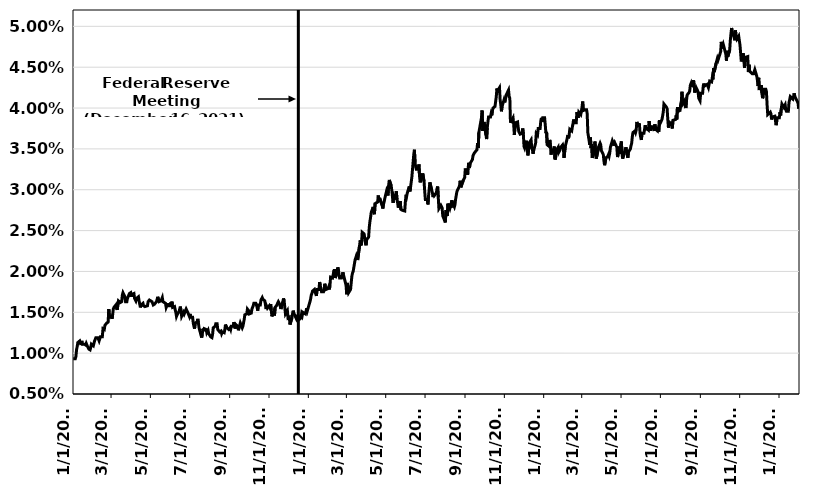
| Category | Series 0 |
|---|---|
| 1/1/21 | 0.009 |
| 1/4/21 | 0.009 |
| 1/5/21 | 0.01 |
| 1/6/21 | 0.01 |
| 1/7/21 | 0.011 |
| 1/8/21 | 0.011 |
| 1/11/21 | 0.012 |
| 1/12/21 | 0.012 |
| 1/13/21 | 0.011 |
| 1/14/21 | 0.012 |
| 1/15/21 | 0.011 |
| 1/18/21 | 0.011 |
| 1/19/21 | 0.011 |
| 1/20/21 | 0.011 |
| 1/21/21 | 0.011 |
| 1/22/21 | 0.011 |
| 1/25/21 | 0.01 |
| 1/26/21 | 0.01 |
| 1/27/21 | 0.01 |
| 1/28/21 | 0.011 |
| 1/29/21 | 0.011 |
| 2/1/21 | 0.011 |
| 2/2/21 | 0.011 |
| 2/3/21 | 0.012 |
| 2/4/21 | 0.012 |
| 2/5/21 | 0.012 |
| 2/8/21 | 0.012 |
| 2/9/21 | 0.012 |
| 2/10/21 | 0.012 |
| 2/11/21 | 0.012 |
| 2/12/21 | 0.012 |
| 2/15/21 | 0.012 |
| 2/16/21 | 0.013 |
| 2/17/21 | 0.013 |
| 2/18/21 | 0.013 |
| 2/19/21 | 0.013 |
| 2/22/21 | 0.014 |
| 2/23/21 | 0.014 |
| 2/24/21 | 0.014 |
| 2/25/21 | 0.015 |
| 2/26/21 | 0.014 |
| 3/1/21 | 0.014 |
| 3/2/21 | 0.014 |
| 3/3/21 | 0.015 |
| 3/4/21 | 0.015 |
| 3/5/21 | 0.016 |
| 3/8/21 | 0.016 |
| 3/9/21 | 0.016 |
| 3/10/21 | 0.015 |
| 3/11/21 | 0.015 |
| 3/12/21 | 0.016 |
| 3/15/21 | 0.016 |
| 3/16/21 | 0.016 |
| 3/17/21 | 0.016 |
| 3/18/21 | 0.017 |
| 3/19/21 | 0.017 |
| 3/22/21 | 0.017 |
| 3/23/21 | 0.016 |
| 3/24/21 | 0.016 |
| 3/25/21 | 0.016 |
| 3/26/21 | 0.017 |
| 3/29/21 | 0.017 |
| 3/30/21 | 0.017 |
| 3/31/21 | 0.017 |
| 4/1/21 | 0.017 |
| 4/2/21 | 0.017 |
| 4/5/21 | 0.017 |
| 4/6/21 | 0.017 |
| 4/7/21 | 0.017 |
| 4/8/21 | 0.016 |
| 4/9/21 | 0.017 |
| 4/12/21 | 0.017 |
| 4/13/21 | 0.016 |
| 4/14/21 | 0.016 |
| 4/15/21 | 0.016 |
| 4/16/21 | 0.016 |
| 4/19/21 | 0.016 |
| 4/20/21 | 0.016 |
| 4/21/21 | 0.016 |
| 4/22/21 | 0.016 |
| 4/23/21 | 0.016 |
| 4/26/21 | 0.016 |
| 4/27/21 | 0.016 |
| 4/28/21 | 0.016 |
| 4/29/21 | 0.016 |
| 4/30/21 | 0.016 |
| 5/3/21 | 0.016 |
| 5/4/21 | 0.016 |
| 5/5/21 | 0.016 |
| 5/6/21 | 0.016 |
| 5/7/21 | 0.016 |
| 5/10/21 | 0.016 |
| 5/11/21 | 0.016 |
| 5/12/21 | 0.017 |
| 5/13/21 | 0.017 |
| 5/14/21 | 0.016 |
| 5/17/21 | 0.016 |
| 5/18/21 | 0.016 |
| 5/19/21 | 0.017 |
| 5/20/21 | 0.016 |
| 5/21/21 | 0.016 |
| 5/24/21 | 0.016 |
| 5/25/21 | 0.016 |
| 5/26/21 | 0.016 |
| 5/27/21 | 0.016 |
| 5/28/21 | 0.016 |
| 5/31/21 | 0.016 |
| 6/1/21 | 0.016 |
| 6/2/21 | 0.016 |
| 6/3/21 | 0.016 |
| 6/4/21 | 0.016 |
| 6/7/21 | 0.016 |
| 6/8/21 | 0.015 |
| 6/9/21 | 0.015 |
| 6/10/21 | 0.014 |
| 6/11/21 | 0.015 |
| 6/14/21 | 0.015 |
| 6/15/21 | 0.015 |
| 6/16/21 | 0.016 |
| 6/17/21 | 0.015 |
| 6/18/21 | 0.014 |
| 6/21/21 | 0.015 |
| 6/22/21 | 0.015 |
| 6/23/21 | 0.015 |
| 6/24/21 | 0.015 |
| 6/25/21 | 0.015 |
| 6/28/21 | 0.015 |
| 6/29/21 | 0.015 |
| 6/30/21 | 0.014 |
| 7/1/21 | 0.015 |
| 7/2/21 | 0.014 |
| 7/5/21 | 0.014 |
| 7/6/21 | 0.014 |
| 7/7/21 | 0.013 |
| 7/8/21 | 0.013 |
| 7/9/21 | 0.014 |
| 7/12/21 | 0.014 |
| 7/13/21 | 0.014 |
| 7/14/21 | 0.014 |
| 7/15/21 | 0.013 |
| 7/16/21 | 0.013 |
| 7/19/21 | 0.012 |
| 7/20/21 | 0.012 |
| 7/21/21 | 0.013 |
| 7/22/21 | 0.013 |
| 7/23/21 | 0.013 |
| 7/26/21 | 0.013 |
| 7/27/21 | 0.012 |
| 7/28/21 | 0.013 |
| 7/29/21 | 0.013 |
| 7/30/21 | 0.012 |
| 8/2/21 | 0.012 |
| 8/3/21 | 0.012 |
| 8/4/21 | 0.012 |
| 8/5/21 | 0.012 |
| 8/6/21 | 0.013 |
| 8/9/21 | 0.013 |
| 8/10/21 | 0.014 |
| 8/11/21 | 0.014 |
| 8/12/21 | 0.014 |
| 8/13/21 | 0.013 |
| 8/16/21 | 0.013 |
| 8/17/21 | 0.013 |
| 8/18/21 | 0.013 |
| 8/19/21 | 0.012 |
| 8/20/21 | 0.013 |
| 8/23/21 | 0.012 |
| 8/24/21 | 0.013 |
| 8/25/21 | 0.014 |
| 8/26/21 | 0.013 |
| 8/27/21 | 0.013 |
| 8/30/21 | 0.013 |
| 8/31/21 | 0.013 |
| 9/1/21 | 0.013 |
| 9/2/21 | 0.013 |
| 9/3/21 | 0.013 |
| 9/6/21 | 0.013 |
| 9/7/21 | 0.014 |
| 9/8/21 | 0.014 |
| 9/9/21 | 0.013 |
| 9/10/21 | 0.014 |
| 9/13/21 | 0.013 |
| 9/14/21 | 0.013 |
| 9/15/21 | 0.013 |
| 9/16/21 | 0.013 |
| 9/17/21 | 0.014 |
| 9/20/21 | 0.013 |
| 9/21/21 | 0.013 |
| 9/22/21 | 0.013 |
| 9/23/21 | 0.014 |
| 9/24/21 | 0.015 |
| 9/27/21 | 0.015 |
| 9/28/21 | 0.015 |
| 9/29/21 | 0.016 |
| 9/30/21 | 0.015 |
| 10/1/21 | 0.015 |
| 10/4/21 | 0.015 |
| 10/5/21 | 0.015 |
| 10/6/21 | 0.015 |
| 10/7/21 | 0.016 |
| 10/8/21 | 0.016 |
| 10/11/21 | 0.016 |
| 10/12/21 | 0.016 |
| 10/13/21 | 0.016 |
| 10/14/21 | 0.015 |
| 10/15/21 | 0.016 |
| 10/18/21 | 0.016 |
| 10/19/21 | 0.016 |
| 10/20/21 | 0.016 |
| 10/21/21 | 0.017 |
| 10/22/21 | 0.017 |
| 10/25/21 | 0.016 |
| 10/26/21 | 0.016 |
| 10/27/21 | 0.015 |
| 10/28/21 | 0.016 |
| 10/29/21 | 0.016 |
| 11/1/21 | 0.016 |
| 11/2/21 | 0.016 |
| 11/3/21 | 0.016 |
| 11/4/21 | 0.015 |
| 11/5/21 | 0.014 |
| 11/8/21 | 0.015 |
| 11/9/21 | 0.015 |
| 11/10/21 | 0.016 |
| 11/12/21 | 0.016 |
| 11/15/21 | 0.016 |
| 11/16/21 | 0.016 |
| 11/17/21 | 0.016 |
| 11/18/21 | 0.016 |
| 11/19/21 | 0.015 |
| 11/22/21 | 0.016 |
| 11/23/21 | 0.017 |
| 11/24/21 | 0.016 |
| 11/25/21 | 0.016 |
| 11/26/21 | 0.015 |
| 11/29/21 | 0.015 |
| 11/30/21 | 0.014 |
| 12/1/21 | 0.014 |
| 12/2/21 | 0.014 |
| 12/3/21 | 0.014 |
| 12/6/21 | 0.014 |
| 12/7/21 | 0.015 |
| 12/8/21 | 0.015 |
| 12/9/21 | 0.015 |
| 12/10/21 | 0.015 |
| 12/13/21 | 0.014 |
| 12/14/21 | 0.014 |
| 12/15/21 | 0.015 |
| 12/16/21 | 0.014 |
| 12/17/21 | 0.014 |
| 12/20/21 | 0.014 |
| 12/21/21 | 0.015 |
| 12/22/21 | 0.015 |
| 12/23/21 | 0.015 |
| 12/27/21 | 0.015 |
| 12/28/21 | 0.015 |
| 12/29/21 | 0.016 |
| 12/30/21 | 0.015 |
| 12/31/21 | 0.015 |
| 1/3/22 | 0.016 |
| 1/4/22 | 0.017 |
| 1/5/22 | 0.017 |
| 1/6/22 | 0.017 |
| 1/7/22 | 0.018 |
| 1/10/22 | 0.018 |
| 1/11/22 | 0.018 |
| 1/12/22 | 0.017 |
| 1/13/22 | 0.017 |
| 1/14/22 | 0.018 |
| 1/17/22 | 0.018 |
| 1/18/22 | 0.019 |
| 1/19/22 | 0.018 |
| 1/20/22 | 0.018 |
| 1/21/22 | 0.018 |
| 1/24/22 | 0.018 |
| 1/25/22 | 0.018 |
| 1/26/22 | 0.019 |
| 1/27/22 | 0.018 |
| 1/28/22 | 0.018 |
| 1/31/22 | 0.018 |
| 2/1/22 | 0.018 |
| 2/2/22 | 0.018 |
| 2/3/22 | 0.018 |
| 2/4/22 | 0.019 |
| 2/7/22 | 0.019 |
| 2/8/22 | 0.02 |
| 2/9/22 | 0.019 |
| 2/10/22 | 0.02 |
| 2/11/22 | 0.019 |
| 2/14/22 | 0.02 |
| 2/15/22 | 0.02 |
| 2/16/22 | 0.02 |
| 2/17/22 | 0.02 |
| 2/18/22 | 0.019 |
| 2/21/22 | 0.019 |
| 2/22/22 | 0.019 |
| 2/23/22 | 0.02 |
| 2/24/22 | 0.02 |
| 2/25/22 | 0.02 |
| 2/28/22 | 0.018 |
| 3/1/22 | 0.017 |
| 3/2/22 | 0.019 |
| 3/3/22 | 0.019 |
| 3/4/22 | 0.017 |
| 3/7/22 | 0.018 |
| 3/8/22 | 0.019 |
| 3/9/22 | 0.019 |
| 3/10/22 | 0.02 |
| 3/11/22 | 0.02 |
| 3/14/22 | 0.021 |
| 3/15/22 | 0.022 |
| 3/16/22 | 0.022 |
| 3/17/22 | 0.022 |
| 3/18/22 | 0.021 |
| 3/21/22 | 0.023 |
| 3/22/22 | 0.024 |
| 3/23/22 | 0.023 |
| 3/24/22 | 0.023 |
| 3/25/22 | 0.025 |
| 3/28/22 | 0.025 |
| 3/29/22 | 0.024 |
| 3/30/22 | 0.024 |
| 3/31/22 | 0.023 |
| 4/1/22 | 0.024 |
| 4/4/22 | 0.024 |
| 4/5/22 | 0.025 |
| 4/6/22 | 0.026 |
| 4/7/22 | 0.027 |
| 4/8/22 | 0.027 |
| 4/11/22 | 0.028 |
| 4/12/22 | 0.027 |
| 4/13/22 | 0.027 |
| 4/14/22 | 0.028 |
| 4/15/22 | 0.028 |
| 4/18/22 | 0.028 |
| 4/19/22 | 0.029 |
| 4/20/22 | 0.028 |
| 4/21/22 | 0.029 |
| 4/22/22 | 0.029 |
| 4/25/22 | 0.028 |
| 4/26/22 | 0.028 |
| 4/27/22 | 0.028 |
| 4/28/22 | 0.028 |
| 4/29/22 | 0.029 |
| 5/2/22 | 0.03 |
| 5/3/22 | 0.03 |
| 5/4/22 | 0.029 |
| 5/5/22 | 0.03 |
| 5/6/22 | 0.031 |
| 5/9/22 | 0.03 |
| 5/10/22 | 0.03 |
| 5/11/22 | 0.029 |
| 5/12/22 | 0.028 |
| 5/13/22 | 0.029 |
| 5/16/22 | 0.029 |
| 5/17/22 | 0.03 |
| 5/18/22 | 0.029 |
| 5/19/22 | 0.028 |
| 5/20/22 | 0.028 |
| 5/23/22 | 0.029 |
| 5/24/22 | 0.028 |
| 5/25/22 | 0.028 |
| 5/26/22 | 0.028 |
| 5/27/22 | 0.027 |
| 5/30/22 | 0.027 |
| 5/31/22 | 0.028 |
| 6/1/22 | 0.029 |
| 6/2/22 | 0.029 |
| 6/3/22 | 0.03 |
| 6/6/22 | 0.03 |
| 6/7/22 | 0.03 |
| 6/8/22 | 0.03 |
| 6/9/22 | 0.03 |
| 6/10/22 | 0.032 |
| 6/13/22 | 0.034 |
| 6/14/22 | 0.035 |
| 6/15/22 | 0.033 |
| 6/16/22 | 0.033 |
| 6/17/22 | 0.032 |
| 6/20/22 | 0.032 |
| 6/21/22 | 0.033 |
| 6/22/22 | 0.032 |
| 6/23/22 | 0.031 |
| 6/24/22 | 0.031 |
| 6/27/22 | 0.032 |
| 6/28/22 | 0.032 |
| 6/29/22 | 0.031 |
| 6/30/22 | 0.03 |
| 7/1/22 | 0.029 |
| 7/4/22 | 0.029 |
| 7/5/22 | 0.028 |
| 7/6/22 | 0.029 |
| 7/7/22 | 0.03 |
| 7/8/22 | 0.031 |
| 7/11/22 | 0.03 |
| 7/12/22 | 0.03 |
| 7/13/22 | 0.029 |
| 7/14/22 | 0.03 |
| 7/15/22 | 0.029 |
| 7/18/22 | 0.03 |
| 7/19/22 | 0.03 |
| 7/20/22 | 0.03 |
| 7/21/22 | 0.029 |
| 7/22/22 | 0.028 |
| 7/25/22 | 0.028 |
| 7/26/22 | 0.028 |
| 7/27/22 | 0.028 |
| 7/28/22 | 0.027 |
| 7/29/22 | 0.027 |
| 8/1/22 | 0.026 |
| 8/2/22 | 0.028 |
| 8/3/22 | 0.027 |
| 8/4/22 | 0.027 |
| 8/5/22 | 0.028 |
| 8/8/22 | 0.028 |
| 8/9/22 | 0.028 |
| 8/10/22 | 0.028 |
| 8/11/22 | 0.029 |
| 8/12/22 | 0.028 |
| 8/15/22 | 0.028 |
| 8/16/22 | 0.028 |
| 8/17/22 | 0.029 |
| 8/18/22 | 0.029 |
| 8/19/22 | 0.03 |
| 8/22/22 | 0.03 |
| 8/23/22 | 0.03 |
| 8/24/22 | 0.031 |
| 8/25/22 | 0.03 |
| 8/26/22 | 0.03 |
| 8/29/22 | 0.031 |
| 8/30/22 | 0.031 |
| 8/31/22 | 0.032 |
| 9/1/22 | 0.033 |
| 9/2/22 | 0.032 |
| 9/5/22 | 0.032 |
| 9/6/22 | 0.033 |
| 9/7/22 | 0.033 |
| 9/8/22 | 0.033 |
| 9/9/22 | 0.033 |
| 9/12/22 | 0.034 |
| 9/13/22 | 0.034 |
| 9/14/22 | 0.034 |
| 9/15/22 | 0.034 |
| 9/16/22 | 0.034 |
| 9/19/22 | 0.035 |
| 9/20/22 | 0.036 |
| 9/21/22 | 0.035 |
| 9/22/22 | 0.037 |
| 9/23/22 | 0.037 |
| 9/26/22 | 0.039 |
| 9/27/22 | 0.04 |
| 9/28/22 | 0.037 |
| 9/29/22 | 0.038 |
| 9/30/22 | 0.038 |
| 10/3/22 | 0.037 |
| 10/4/22 | 0.036 |
| 10/5/22 | 0.038 |
| 10/6/22 | 0.038 |
| 10/7/22 | 0.039 |
| 10/10/22 | 0.039 |
| 10/11/22 | 0.039 |
| 10/12/22 | 0.039 |
| 10/13/22 | 0.04 |
| 10/14/22 | 0.04 |
| 10/17/22 | 0.04 |
| 10/18/22 | 0.04 |
| 10/19/22 | 0.041 |
| 10/20/22 | 0.042 |
| 10/21/22 | 0.042 |
| 10/24/22 | 0.042 |
| 10/25/22 | 0.041 |
| 10/26/22 | 0.04 |
| 10/27/22 | 0.04 |
| 10/28/22 | 0.04 |
| 10/31/22 | 0.041 |
| 11/1/22 | 0.041 |
| 11/2/22 | 0.041 |
| 11/3/22 | 0.041 |
| 11/4/22 | 0.042 |
| 11/7/22 | 0.042 |
| 11/8/22 | 0.041 |
| 11/9/22 | 0.041 |
| 11/10/22 | 0.038 |
| 11/14/22 | 0.039 |
| 11/15/22 | 0.038 |
| 11/16/22 | 0.037 |
| 11/17/22 | 0.038 |
| 11/18/22 | 0.038 |
| 11/21/22 | 0.038 |
| 11/22/22 | 0.038 |
| 11/23/22 | 0.037 |
| 11/24/22 | 0.037 |
| 11/25/22 | 0.037 |
| 11/28/22 | 0.037 |
| 11/29/22 | 0.038 |
| 11/30/22 | 0.037 |
| 12/1/22 | 0.035 |
| 12/2/22 | 0.035 |
| 12/5/22 | 0.036 |
| 12/6/22 | 0.035 |
| 12/7/22 | 0.034 |
| 12/8/22 | 0.035 |
| 12/9/22 | 0.036 |
| 12/12/22 | 0.036 |
| 12/13/22 | 0.035 |
| 12/14/22 | 0.035 |
| 12/15/22 | 0.034 |
| 12/16/22 | 0.035 |
| 12/19/22 | 0.036 |
| 12/20/22 | 0.037 |
| 12/21/22 | 0.037 |
| 12/22/22 | 0.037 |
| 12/23/22 | 0.038 |
| 12/26/22 | 0.038 |
| 12/27/22 | 0.038 |
| 12/28/22 | 0.039 |
| 12/29/22 | 0.038 |
| 12/30/22 | 0.039 |
| 1/2/23 | 0.039 |
| 1/3/23 | 0.038 |
| 1/4/23 | 0.037 |
| 1/5/23 | 0.037 |
| 1/6/23 | 0.036 |
| 1/9/23 | 0.035 |
| 1/10/23 | 0.036 |
| 1/11/23 | 0.035 |
| 1/12/23 | 0.034 |
| 1/13/23 | 0.035 |
| 1/16/23 | 0.035 |
| 1/17/23 | 0.035 |
| 1/18/23 | 0.034 |
| 1/19/23 | 0.034 |
| 1/20/23 | 0.035 |
| 1/23/23 | 0.035 |
| 1/24/23 | 0.035 |
| 1/25/23 | 0.035 |
| 1/26/23 | 0.035 |
| 1/27/23 | 0.035 |
| 1/30/23 | 0.036 |
| 1/31/23 | 0.035 |
| 2/1/23 | 0.034 |
| 2/2/23 | 0.034 |
| 2/3/23 | 0.035 |
| 2/6/23 | 0.036 |
| 2/7/23 | 0.037 |
| 2/8/23 | 0.036 |
| 2/9/23 | 0.037 |
| 2/10/23 | 0.037 |
| 2/13/23 | 0.037 |
| 2/14/23 | 0.038 |
| 2/15/23 | 0.038 |
| 2/16/23 | 0.039 |
| 2/17/23 | 0.038 |
| 2/20/23 | 0.038 |
| 2/21/23 | 0.04 |
| 2/22/23 | 0.039 |
| 2/23/23 | 0.039 |
| 2/24/23 | 0.04 |
| 2/27/23 | 0.039 |
| 2/28/23 | 0.039 |
| 3/1/23 | 0.04 |
| 3/2/23 | 0.041 |
| 3/3/23 | 0.04 |
| 3/6/23 | 0.04 |
| 3/7/23 | 0.04 |
| 3/8/23 | 0.04 |
| 3/9/23 | 0.039 |
| 3/10/23 | 0.037 |
| 3/13/23 | 0.036 |
| 3/14/23 | 0.036 |
| 3/15/23 | 0.035 |
| 3/16/23 | 0.036 |
| 3/17/23 | 0.034 |
| 3/20/23 | 0.035 |
| 3/21/23 | 0.036 |
| 3/22/23 | 0.035 |
| 3/23/23 | 0.034 |
| 3/24/23 | 0.034 |
| 3/27/23 | 0.035 |
| 3/28/23 | 0.036 |
| 3/29/23 | 0.036 |
| 3/30/23 | 0.036 |
| 3/31/23 | 0.035 |
| 4/3/23 | 0.034 |
| 4/4/23 | 0.034 |
| 4/5/23 | 0.033 |
| 4/6/23 | 0.033 |
| 4/7/23 | 0.034 |
| 4/10/23 | 0.034 |
| 4/11/23 | 0.034 |
| 4/12/23 | 0.034 |
| 4/13/23 | 0.034 |
| 4/14/23 | 0.035 |
| 4/17/23 | 0.036 |
| 4/18/23 | 0.036 |
| 4/19/23 | 0.036 |
| 4/20/23 | 0.035 |
| 4/21/23 | 0.036 |
| 4/24/23 | 0.035 |
| 4/25/23 | 0.034 |
| 4/26/23 | 0.034 |
| 4/27/23 | 0.035 |
| 4/28/23 | 0.034 |
| 5/1/23 | 0.036 |
| 5/2/23 | 0.034 |
| 5/3/23 | 0.034 |
| 5/4/23 | 0.034 |
| 5/5/23 | 0.034 |
| 5/8/23 | 0.035 |
| 5/9/23 | 0.035 |
| 5/10/23 | 0.034 |
| 5/11/23 | 0.034 |
| 5/12/23 | 0.035 |
| 5/15/23 | 0.035 |
| 5/16/23 | 0.035 |
| 5/17/23 | 0.036 |
| 5/18/23 | 0.036 |
| 5/19/23 | 0.037 |
| 5/22/23 | 0.037 |
| 5/23/23 | 0.037 |
| 5/24/23 | 0.037 |
| 5/25/23 | 0.038 |
| 5/26/23 | 0.038 |
| 5/29/23 | 0.038 |
| 5/30/23 | 0.037 |
| 5/31/23 | 0.036 |
| 6/1/23 | 0.036 |
| 6/2/23 | 0.037 |
| 6/5/23 | 0.037 |
| 6/6/23 | 0.037 |
| 6/7/23 | 0.038 |
| 6/8/23 | 0.037 |
| 6/9/23 | 0.038 |
| 6/12/23 | 0.037 |
| 6/13/23 | 0.038 |
| 6/14/23 | 0.038 |
| 6/15/23 | 0.037 |
| 6/16/23 | 0.038 |
| 6/19/23 | 0.038 |
| 6/20/23 | 0.037 |
| 6/21/23 | 0.037 |
| 6/22/23 | 0.038 |
| 6/23/23 | 0.037 |
| 6/26/23 | 0.037 |
| 6/27/23 | 0.038 |
| 6/28/23 | 0.037 |
| 6/29/23 | 0.038 |
| 6/30/23 | 0.038 |
| 7/3/23 | 0.039 |
| 7/4/23 | 0.039 |
| 7/5/23 | 0.04 |
| 7/6/23 | 0.04 |
| 7/7/23 | 0.041 |
| 7/10/23 | 0.04 |
| 7/11/23 | 0.04 |
| 7/12/23 | 0.039 |
| 7/13/23 | 0.038 |
| 7/14/23 | 0.038 |
| 7/17/23 | 0.038 |
| 7/18/23 | 0.038 |
| 7/19/23 | 0.038 |
| 7/20/23 | 0.038 |
| 7/21/23 | 0.038 |
| 7/24/23 | 0.039 |
| 7/25/23 | 0.039 |
| 7/26/23 | 0.039 |
| 7/27/23 | 0.04 |
| 7/28/23 | 0.04 |
| 7/31/23 | 0.04 |
| 8/1/23 | 0.04 |
| 8/2/23 | 0.041 |
| 8/3/23 | 0.042 |
| 8/4/23 | 0.04 |
| 8/7/23 | 0.041 |
| 8/8/23 | 0.04 |
| 8/9/23 | 0.04 |
| 8/10/23 | 0.041 |
| 8/11/23 | 0.042 |
| 8/14/23 | 0.042 |
| 8/15/23 | 0.042 |
| 8/16/23 | 0.043 |
| 8/17/23 | 0.043 |
| 8/18/23 | 0.043 |
| 8/21/23 | 0.043 |
| 8/22/23 | 0.043 |
| 8/23/23 | 0.042 |
| 8/24/23 | 0.042 |
| 8/25/23 | 0.042 |
| 8/28/23 | 0.042 |
| 8/29/23 | 0.041 |
| 8/30/23 | 0.041 |
| 8/31/23 | 0.041 |
| 9/1/23 | 0.042 |
| 9/4/23 | 0.042 |
| 9/5/23 | 0.043 |
| 9/6/23 | 0.043 |
| 9/7/23 | 0.043 |
| 9/8/23 | 0.043 |
| 9/11/23 | 0.043 |
| 9/12/23 | 0.043 |
| 9/13/23 | 0.042 |
| 9/14/23 | 0.043 |
| 9/15/23 | 0.043 |
| 9/18/23 | 0.043 |
| 9/19/23 | 0.044 |
| 9/20/23 | 0.044 |
| 9/21/23 | 0.045 |
| 9/22/23 | 0.044 |
| 9/25/23 | 0.046 |
| 9/26/23 | 0.046 |
| 9/27/23 | 0.046 |
| 9/28/23 | 0.046 |
| 9/29/23 | 0.046 |
| 10/2/23 | 0.047 |
| 10/3/23 | 0.048 |
| 10/4/23 | 0.047 |
| 10/5/23 | 0.047 |
| 10/6/23 | 0.048 |
| 10/10/23 | 0.047 |
| 10/11/23 | 0.046 |
| 10/12/23 | 0.047 |
| 10/13/23 | 0.046 |
| 10/16/23 | 0.047 |
| 10/17/23 | 0.048 |
| 10/18/23 | 0.049 |
| 10/19/23 | 0.05 |
| 10/20/23 | 0.049 |
| 10/23/23 | 0.049 |
| 10/24/23 | 0.048 |
| 10/25/23 | 0.05 |
| 10/26/23 | 0.049 |
| 10/27/23 | 0.048 |
| 10/30/23 | 0.049 |
| 10/31/23 | 0.049 |
| 11/1/23 | 0.048 |
| 11/2/23 | 0.047 |
| 11/3/23 | 0.046 |
| 11/6/23 | 0.047 |
| 11/7/23 | 0.046 |
| 11/8/23 | 0.045 |
| 11/9/23 | 0.046 |
| 11/10/23 | 0.046 |
| 11/13/23 | 0.046 |
| 11/14/23 | 0.044 |
| 11/15/23 | 0.045 |
| 11/16/23 | 0.045 |
| 11/17/23 | 0.044 |
| 11/20/23 | 0.044 |
| 11/21/23 | 0.044 |
| 11/22/23 | 0.044 |
| 11/23/23 | 0.044 |
| 11/24/23 | 0.045 |
| 11/27/23 | 0.044 |
| 11/28/23 | 0.043 |
| 11/29/23 | 0.043 |
| 11/30/23 | 0.044 |
| 12/1/23 | 0.042 |
| 12/4/23 | 0.043 |
| 12/5/23 | 0.042 |
| 12/6/23 | 0.041 |
| 12/7/23 | 0.041 |
| 12/8/23 | 0.042 |
| 12/11/23 | 0.042 |
| 12/12/23 | 0.042 |
| 12/13/23 | 0.04 |
| 12/14/23 | 0.039 |
| 12/15/23 | 0.039 |
| 12/18/23 | 0.04 |
| 12/19/23 | 0.039 |
| 12/20/23 | 0.039 |
| 12/21/23 | 0.039 |
| 12/22/23 | 0.039 |
| 12/25/23 | 0.039 |
| 12/26/23 | 0.039 |
| 12/27/23 | 0.038 |
| 12/28/23 | 0.038 |
| 12/29/23 | 0.039 |
| 1/1/24 | 0.039 |
| 1/2/24 | 0.04 |
| 1/3/24 | 0.039 |
| 1/4/24 | 0.04 |
| 1/5/24 | 0.04 |
| 1/8/24 | 0.04 |
| 1/9/24 | 0.04 |
| 1/10/24 | 0.04 |
| 1/11/24 | 0.04 |
| 1/12/24 | 0.04 |
| 1/15/24 | 0.04 |
| 1/16/24 | 0.041 |
| 1/17/24 | 0.041 |
| 1/18/24 | 0.041 |
| 1/19/24 | 0.042 |
| 1/22/24 | 0.041 |
| 1/23/24 | 0.041 |
| 1/24/24 | 0.042 |
| 1/25/24 | 0.041 |
| 1/26/24 | 0.042 |
| 1/29/24 | 0.041 |
| 1/30/24 | 0.041 |
| 1/31/24 | 0.04 |